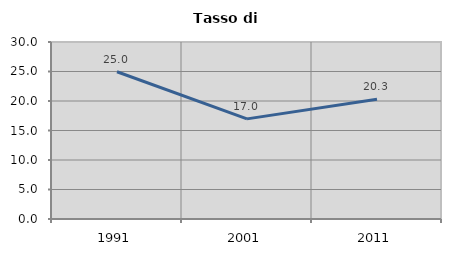
| Category | Tasso di disoccupazione   |
|---|---|
| 1991.0 | 24.957 |
| 2001.0 | 16.969 |
| 2011.0 | 20.307 |